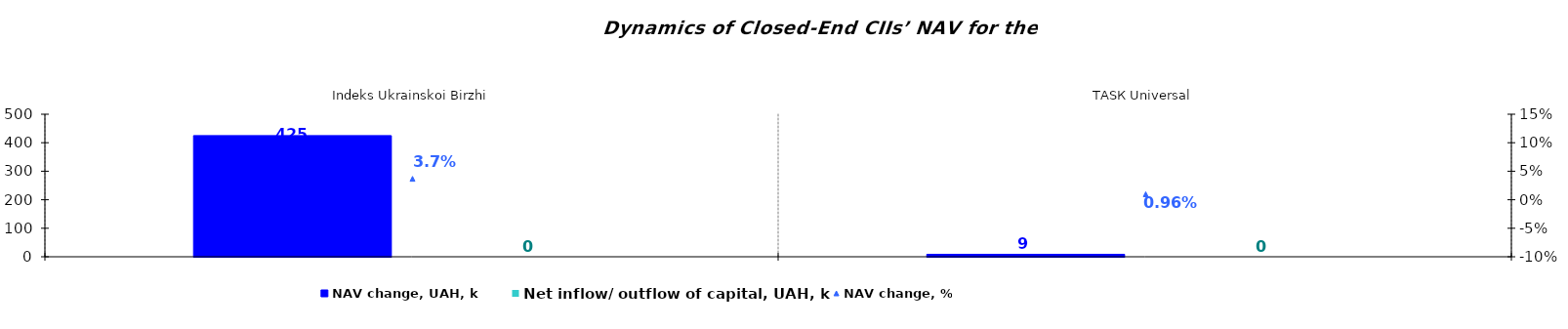
| Category | NAV change, UAH, k | Net inflow/ outflow of capital, UAH, k |
|---|---|---|
| Іndeks Ukrainskoi Birzhi | 425.047 | 0 |
| ТАSК Universal | 8.615 | 0 |